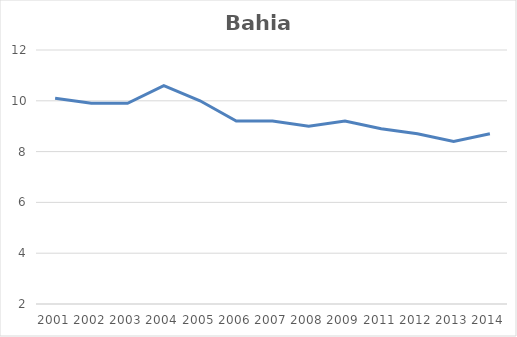
| Category | Total |
|---|---|
| 2001.0 | 10.1 |
| 2002.0 | 9.9 |
| 2003.0 | 9.9 |
| 2004.0 | 10.6 |
| 2005.0 | 10 |
| 2006.0 | 9.2 |
| 2007.0 | 9.2 |
| 2008.0 | 9 |
| 2009.0 | 9.2 |
| 2011.0 | 8.9 |
| 2012.0 | 8.7 |
| 2013.0 | 8.4 |
| 2014.0 | 8.7 |